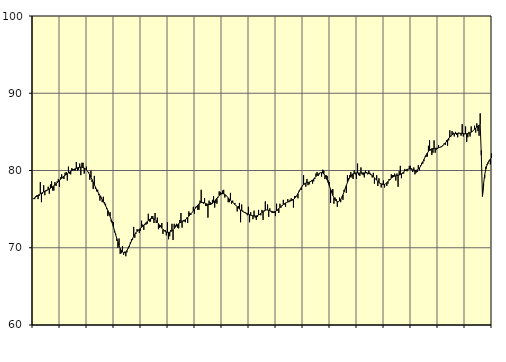
| Category | Samtliga sysselsatta (inkl. sysselsatta utomlands) | Series 1 |
|---|---|---|
| nan | 76.3 | 76.37 |
| 87.0 | 76.3 | 76.47 |
| 87.0 | 76.7 | 76.57 |
| 87.0 | 76.8 | 76.68 |
| 87.0 | 76.3 | 76.79 |
| 87.0 | 76.7 | 76.89 |
| 87.0 | 78.5 | 76.98 |
| 87.0 | 75.9 | 77.07 |
| 87.0 | 77 | 77.16 |
| 87.0 | 78.1 | 77.24 |
| 87.0 | 76.8 | 77.32 |
| 87.0 | 77.3 | 77.4 |
| nan | 77.4 | 77.47 |
| 88.0 | 77.9 | 77.55 |
| 88.0 | 77 | 77.63 |
| 88.0 | 78.2 | 77.71 |
| 88.0 | 78.6 | 77.8 |
| 88.0 | 77.4 | 77.9 |
| 88.0 | 77.4 | 78.01 |
| 88.0 | 78.5 | 78.13 |
| 88.0 | 78 | 78.26 |
| 88.0 | 78.6 | 78.4 |
| 88.0 | 78.9 | 78.55 |
| 88.0 | 77.9 | 78.7 |
| nan | 79.1 | 78.86 |
| 89.0 | 79.5 | 79.01 |
| 89.0 | 79 | 79.15 |
| 89.0 | 78.9 | 79.28 |
| 89.0 | 79.7 | 79.39 |
| 89.0 | 79.8 | 79.49 |
| 89.0 | 78.7 | 79.59 |
| 89.0 | 80.5 | 79.7 |
| 89.0 | 79.6 | 79.8 |
| 89.0 | 79.5 | 79.89 |
| 89.0 | 80.3 | 79.98 |
| 89.0 | 80.2 | 80.07 |
| nan | 80 | 80.15 |
| 90.0 | 80 | 80.22 |
| 90.0 | 81.1 | 80.29 |
| 90.0 | 80 | 80.35 |
| 90.0 | 80.1 | 80.39 |
| 90.0 | 80.9 | 80.42 |
| 90.0 | 79.4 | 80.44 |
| 90.0 | 81 | 80.43 |
| 90.0 | 81 | 80.39 |
| 90.0 | 79.6 | 80.32 |
| 90.0 | 80.3 | 80.22 |
| 90.0 | 80.5 | 80.07 |
| nan | 79.9 | 79.89 |
| 91.0 | 79.8 | 79.67 |
| 91.0 | 78.8 | 79.42 |
| 91.0 | 80 | 79.13 |
| 91.0 | 78.5 | 78.82 |
| 91.0 | 77.6 | 78.5 |
| 91.0 | 79.3 | 78.17 |
| 91.0 | 77.6 | 77.86 |
| 91.0 | 77.3 | 77.55 |
| 91.0 | 77.5 | 77.27 |
| 91.0 | 76.8 | 77 |
| 91.0 | 76.1 | 76.74 |
| nan | 76.6 | 76.48 |
| 92.0 | 75.9 | 76.23 |
| 92.0 | 76.6 | 75.97 |
| 92.0 | 75.9 | 75.71 |
| 92.0 | 75.7 | 75.43 |
| 92.0 | 75 | 75.14 |
| 92.0 | 74.1 | 74.82 |
| 92.0 | 74.3 | 74.46 |
| 92.0 | 74.6 | 74.07 |
| 92.0 | 73.4 | 73.64 |
| 92.0 | 73.4 | 73.17 |
| 92.0 | 73.3 | 72.68 |
| nan | 72 | 72.18 |
| 93.0 | 71.8 | 71.68 |
| 93.0 | 70.9 | 71.18 |
| 93.0 | 70 | 70.71 |
| 93.0 | 71.2 | 70.28 |
| 93.0 | 69.2 | 69.91 |
| 93.0 | 69.3 | 69.63 |
| 93.0 | 70.2 | 69.44 |
| 93.0 | 69.1 | 69.35 |
| 93.0 | 69.5 | 69.36 |
| 93.0 | 68.9 | 69.46 |
| 93.0 | 69.4 | 69.65 |
| nan | 70 | 69.91 |
| 94.0 | 70.1 | 70.22 |
| 94.0 | 70.7 | 70.54 |
| 94.0 | 71.1 | 70.88 |
| 94.0 | 71 | 71.19 |
| 94.0 | 72.7 | 71.48 |
| 94.0 | 71.3 | 71.74 |
| 94.0 | 71.8 | 71.95 |
| 94.0 | 72.4 | 72.12 |
| 94.0 | 72.2 | 72.26 |
| 94.0 | 71.9 | 72.39 |
| 94.0 | 72.2 | 72.51 |
| nan | 73.5 | 72.64 |
| 95.0 | 73 | 72.78 |
| 95.0 | 72.3 | 72.92 |
| 95.0 | 73 | 73.08 |
| 95.0 | 73 | 73.24 |
| 95.0 | 73.1 | 73.4 |
| 95.0 | 74.4 | 73.54 |
| 95.0 | 73.4 | 73.66 |
| 95.0 | 73.4 | 73.75 |
| 95.0 | 74.1 | 73.8 |
| 95.0 | 74.1 | 73.8 |
| 95.0 | 73.2 | 73.75 |
| nan | 74.5 | 73.65 |
| 96.0 | 73.2 | 73.49 |
| 96.0 | 73.9 | 73.31 |
| 96.0 | 72.4 | 73.12 |
| 96.0 | 72.6 | 72.92 |
| 96.0 | 72.9 | 72.72 |
| 96.0 | 73.2 | 72.54 |
| 96.0 | 71.8 | 72.37 |
| 96.0 | 72.2 | 72.23 |
| 96.0 | 72.3 | 72.11 |
| 96.0 | 71.6 | 72.04 |
| 96.0 | 73.3 | 72 |
| nan | 71.1 | 71.99 |
| 97.0 | 71.5 | 72.02 |
| 97.0 | 72.3 | 72.09 |
| 97.0 | 73.1 | 72.19 |
| 97.0 | 71 | 72.33 |
| 97.0 | 73.1 | 72.49 |
| 97.0 | 72.9 | 72.66 |
| 97.0 | 73.1 | 72.82 |
| 97.0 | 72.6 | 72.98 |
| 97.0 | 72.5 | 73.1 |
| 97.0 | 73.6 | 73.21 |
| 97.0 | 74.5 | 73.29 |
| nan | 72.6 | 73.37 |
| 98.0 | 73.6 | 73.45 |
| 98.0 | 73.4 | 73.54 |
| 98.0 | 73.3 | 73.64 |
| 98.0 | 73.9 | 73.77 |
| 98.0 | 73.2 | 73.92 |
| 98.0 | 74.7 | 74.08 |
| 98.0 | 74.5 | 74.24 |
| 98.0 | 74.3 | 74.41 |
| 98.0 | 74.6 | 74.58 |
| 98.0 | 75.3 | 74.76 |
| 98.0 | 74.4 | 74.94 |
| nan | 75.3 | 75.13 |
| 99.0 | 75.4 | 75.33 |
| 99.0 | 74.9 | 75.52 |
| 99.0 | 74.9 | 75.68 |
| 99.0 | 76.1 | 75.79 |
| 99.0 | 77.5 | 75.86 |
| 99.0 | 75.8 | 75.87 |
| 99.0 | 75.7 | 75.85 |
| 99.0 | 76.4 | 75.8 |
| 99.0 | 75.4 | 75.73 |
| 99.0 | 75.4 | 75.67 |
| 99.0 | 73.9 | 75.61 |
| nan | 76.1 | 75.58 |
| 0.0 | 75.9 | 75.59 |
| 0.0 | 75.8 | 75.65 |
| 0.0 | 76.2 | 75.75 |
| 0.0 | 76.7 | 75.89 |
| 0.0 | 75.2 | 76.05 |
| 0.0 | 75.8 | 76.23 |
| 0.0 | 75.7 | 76.42 |
| 0.0 | 76.5 | 76.59 |
| 0.0 | 77.3 | 76.75 |
| 0.0 | 77.2 | 76.87 |
| 0.0 | 77.1 | 76.96 |
| nan | 77.4 | 76.99 |
| 1.0 | 77.5 | 76.97 |
| 1.0 | 76.5 | 76.9 |
| 1.0 | 76.7 | 76.78 |
| 1.0 | 76.6 | 76.63 |
| 1.0 | 75.9 | 76.46 |
| 1.0 | 75.9 | 76.31 |
| 1.0 | 77.1 | 76.16 |
| 1.0 | 75.7 | 76.02 |
| 1.0 | 76.1 | 75.89 |
| 1.0 | 75.7 | 75.74 |
| 1.0 | 75.8 | 75.6 |
| nan | 75.4 | 75.45 |
| 2.0 | 74.7 | 75.29 |
| 2.0 | 75.4 | 75.15 |
| 2.0 | 75.8 | 75.01 |
| 2.0 | 73.3 | 74.89 |
| 2.0 | 75.6 | 74.79 |
| 2.0 | 74.8 | 74.7 |
| 2.0 | 74.6 | 74.62 |
| 2.0 | 74.5 | 74.55 |
| 2.0 | 74.4 | 74.48 |
| 2.0 | 74.2 | 74.41 |
| 2.0 | 75.3 | 74.34 |
| nan | 73.3 | 74.27 |
| 3.0 | 74.6 | 74.21 |
| 3.0 | 74.2 | 74.17 |
| 3.0 | 73.7 | 74.13 |
| 3.0 | 74.8 | 74.11 |
| 3.0 | 73.9 | 74.11 |
| 3.0 | 73.6 | 74.12 |
| 3.0 | 74 | 74.17 |
| 3.0 | 74.9 | 74.24 |
| 3.0 | 74.3 | 74.34 |
| 3.0 | 74.2 | 74.45 |
| 3.0 | 74.9 | 74.58 |
| nan | 73.6 | 74.7 |
| 4.0 | 74.7 | 74.8 |
| 4.0 | 76 | 74.86 |
| 4.0 | 74.9 | 74.89 |
| 4.0 | 75.6 | 74.88 |
| 4.0 | 74 | 74.85 |
| 4.0 | 75.1 | 74.79 |
| 4.0 | 74.7 | 74.74 |
| 4.0 | 74.5 | 74.68 |
| 4.0 | 74.5 | 74.65 |
| 4.0 | 74.5 | 74.66 |
| 4.0 | 74.1 | 74.71 |
| nan | 75.7 | 74.8 |
| 5.0 | 74.8 | 74.93 |
| 5.0 | 74.5 | 75.07 |
| 5.0 | 75.7 | 75.21 |
| 5.0 | 75.2 | 75.35 |
| 5.0 | 75.4 | 75.48 |
| 5.0 | 76.2 | 75.6 |
| 5.0 | 75.6 | 75.71 |
| 5.0 | 75.3 | 75.8 |
| 5.0 | 75.9 | 75.87 |
| 5.0 | 76.3 | 75.93 |
| 5.0 | 75.9 | 75.99 |
| nan | 76.2 | 76.04 |
| 6.0 | 76.4 | 76.09 |
| 6.0 | 76.3 | 76.16 |
| 6.0 | 75.2 | 76.26 |
| 6.0 | 76.7 | 76.39 |
| 6.0 | 76.7 | 76.56 |
| 6.0 | 76.8 | 76.77 |
| 6.0 | 76.4 | 77.01 |
| 6.0 | 77.4 | 77.28 |
| 6.0 | 77.6 | 77.54 |
| 6.0 | 77.5 | 77.8 |
| 6.0 | 78.1 | 78.01 |
| nan | 79.4 | 78.19 |
| 7.0 | 78.2 | 78.3 |
| 7.0 | 77.9 | 78.38 |
| 7.0 | 78.9 | 78.42 |
| 7.0 | 78.1 | 78.46 |
| 7.0 | 78.2 | 78.49 |
| 7.0 | 78.6 | 78.55 |
| 7.0 | 78.7 | 78.63 |
| 7.0 | 78.3 | 78.75 |
| 7.0 | 78.6 | 78.89 |
| 7.0 | 78.9 | 79.06 |
| 7.0 | 79.6 | 79.22 |
| nan | 79.8 | 79.38 |
| 8.0 | 79.3 | 79.52 |
| 8.0 | 79.5 | 79.64 |
| 8.0 | 79.7 | 79.71 |
| 8.0 | 79.2 | 79.73 |
| 8.0 | 80.1 | 79.68 |
| 8.0 | 80 | 79.56 |
| 8.0 | 78.9 | 79.37 |
| 8.0 | 79.4 | 79.11 |
| 8.0 | 79.3 | 78.78 |
| 8.0 | 78.7 | 78.4 |
| 8.0 | 78.5 | 77.99 |
| nan | 75.8 | 77.57 |
| 9.0 | 77.4 | 77.16 |
| 9.0 | 77.6 | 76.78 |
| 9.0 | 75.7 | 76.47 |
| 9.0 | 76.5 | 76.22 |
| 9.0 | 76.3 | 76.05 |
| 9.0 | 75.3 | 75.97 |
| 9.0 | 76 | 75.97 |
| 9.0 | 76.5 | 76.07 |
| 9.0 | 75.9 | 76.25 |
| 9.0 | 76.6 | 76.51 |
| 9.0 | 76.2 | 76.85 |
| nan | 77.5 | 77.24 |
| 10.0 | 77.7 | 77.65 |
| 10.0 | 77.1 | 78.06 |
| 10.0 | 79.4 | 78.45 |
| 10.0 | 79 | 78.79 |
| 10.0 | 79.4 | 79.07 |
| 10.0 | 79.8 | 79.29 |
| 10.0 | 79.1 | 79.46 |
| 10.0 | 78.9 | 79.57 |
| 10.0 | 80 | 79.64 |
| 10.0 | 79.5 | 79.67 |
| 10.0 | 78.9 | 79.69 |
| nan | 80.9 | 79.69 |
| 11.0 | 79.4 | 79.68 |
| 11.0 | 79.3 | 79.68 |
| 11.0 | 80.4 | 79.69 |
| 11.0 | 79.5 | 79.69 |
| 11.0 | 79.4 | 79.69 |
| 11.0 | 79.1 | 79.69 |
| 11.0 | 80 | 79.69 |
| 11.0 | 79.8 | 79.68 |
| 11.0 | 79.5 | 79.65 |
| 11.0 | 80 | 79.61 |
| 11.0 | 79.7 | 79.55 |
| nan | 79.4 | 79.46 |
| 12.0 | 79.1 | 79.34 |
| 12.0 | 79.7 | 79.2 |
| 12.0 | 78.3 | 79.05 |
| 12.0 | 78.9 | 78.89 |
| 12.0 | 79.4 | 78.74 |
| 12.0 | 78 | 78.6 |
| 12.0 | 79 | 78.47 |
| 12.0 | 78.3 | 78.36 |
| 12.0 | 77.8 | 78.27 |
| 12.0 | 78.3 | 78.21 |
| 12.0 | 78.7 | 78.19 |
| nan | 77.8 | 78.21 |
| 13.0 | 78.3 | 78.29 |
| 13.0 | 78 | 78.42 |
| 13.0 | 78.3 | 78.57 |
| 13.0 | 78.9 | 78.72 |
| 13.0 | 78.8 | 78.88 |
| 13.0 | 79.5 | 79.01 |
| 13.0 | 79.4 | 79.12 |
| 13.0 | 79.4 | 79.21 |
| 13.0 | 79.6 | 79.27 |
| 13.0 | 78.7 | 79.31 |
| 13.0 | 79.6 | 79.34 |
| nan | 77.9 | 79.38 |
| 14.0 | 79.9 | 79.42 |
| 14.0 | 80.6 | 79.49 |
| 14.0 | 79 | 79.58 |
| 14.0 | 79.6 | 79.69 |
| 14.0 | 79.6 | 79.82 |
| 14.0 | 80.2 | 79.95 |
| 14.0 | 80 | 80.06 |
| 14.0 | 79.9 | 80.14 |
| 14.0 | 80.2 | 80.18 |
| 14.0 | 80.6 | 80.19 |
| 14.0 | 80.6 | 80.18 |
| nan | 80.3 | 80.14 |
| 15.0 | 79.8 | 80.09 |
| 15.0 | 80.4 | 80.04 |
| 15.0 | 79.5 | 80.02 |
| 15.0 | 79.7 | 80.02 |
| 15.0 | 79.8 | 80.07 |
| 15.0 | 80.7 | 80.17 |
| 15.0 | 80 | 80.33 |
| 15.0 | 80.7 | 80.55 |
| 15.0 | 81 | 80.82 |
| 15.0 | 80.9 | 81.12 |
| 15.0 | 81.2 | 81.43 |
| nan | 81.8 | 81.73 |
| 16.0 | 81.8 | 82.02 |
| 16.0 | 81.8 | 82.26 |
| 16.0 | 83.2 | 82.46 |
| 16.0 | 83.9 | 82.62 |
| 16.0 | 82.6 | 82.74 |
| 16.0 | 82 | 82.81 |
| 16.0 | 82.3 | 82.84 |
| 16.0 | 83.9 | 82.86 |
| 16.0 | 82.3 | 82.87 |
| 16.0 | 82.7 | 82.88 |
| 16.0 | 82.8 | 82.9 |
| nan | 83.3 | 82.94 |
| 17.0 | 83 | 82.99 |
| 17.0 | 83 | 83.06 |
| 17.0 | 83.1 | 83.15 |
| 17.0 | 83.3 | 83.26 |
| 17.0 | 83.5 | 83.4 |
| 17.0 | 83.3 | 83.56 |
| 17.0 | 83.9 | 83.75 |
| 17.0 | 83.2 | 83.96 |
| 17.0 | 83.9 | 84.16 |
| 17.0 | 85.2 | 84.34 |
| 17.0 | 84.4 | 84.5 |
| nan | 85.1 | 84.62 |
| 18.0 | 84.9 | 84.7 |
| 18.0 | 84.4 | 84.75 |
| 18.0 | 85 | 84.78 |
| 18.0 | 84.6 | 84.8 |
| 18.0 | 84.3 | 84.81 |
| 18.0 | 84.9 | 84.82 |
| 18.0 | 84.8 | 84.81 |
| 18.0 | 84.5 | 84.81 |
| 18.0 | 86 | 84.79 |
| 18.0 | 84.4 | 84.78 |
| 18.0 | 84.7 | 84.76 |
| nan | 85.7 | 84.75 |
| 19.0 | 83.7 | 84.76 |
| 19.0 | 84.3 | 84.78 |
| 19.0 | 85 | 84.82 |
| 19.0 | 84.4 | 84.87 |
| 19.0 | 85.7 | 84.96 |
| 19.0 | 85.1 | 85.06 |
| 19.0 | 85.2 | 85.19 |
| 19.0 | 85.8 | 85.33 |
| 19.0 | 84.9 | 85.47 |
| 19.0 | 86.1 | 85.61 |
| 19.0 | 85.1 | 85.74 |
| nan | 84.5 | 85.86 |
| 20.0 | 87.4 | 85.96 |
| 20.0 | 82.6 | 81.96 |
| 20.0 | 76.8 | 76.66 |
| 20.0 | 78 | 78.29 |
| 20.0 | 79 | 79.42 |
| 20.0 | 80.5 | 80.18 |
| 20.0 | 80.8 | 80.69 |
| 20.0 | 80.9 | 81.04 |
| 20.0 | 81.2 | 81.29 |
| 20.0 | 80.8 | 81.47 |
| 20.0 | 82.2 | 81.63 |